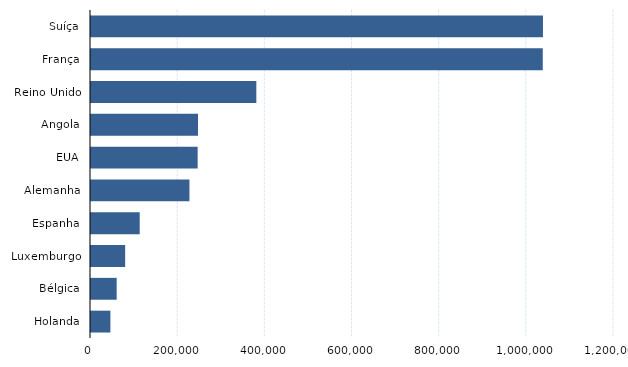
| Category | Series 2 |
|---|---|
| Suíça | 1037020 |
| França | 1036570 |
| Reino Unido | 379350 |
| Angola | 245530 |
| EUA | 244740 |
| Alemanha | 225870 |
| Espanha | 111780 |
| Luxemburgo | 78400 |
| Bélgica | 58900 |
| Holanda | 44470 |